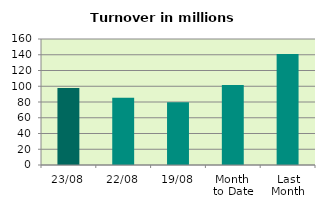
| Category | Series 0 |
|---|---|
| 23/08 | 97.841 |
| 22/08 | 85.501 |
| 19/08 | 79.691 |
| Month 
to Date | 101.714 |
| Last
Month | 140.832 |